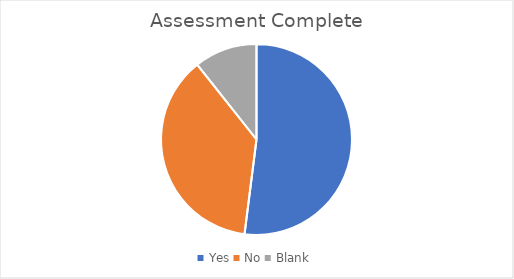
| Category | Series 0 |
|---|---|
| Yes | 39 |
| No | 28 |
| Blank | 8 |